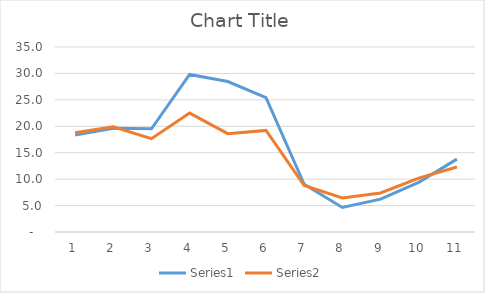
| Category | Series 0 | Series 1 |
|---|---|---|
| 0 | 18.351 | 18.778 |
| 1 | 19.634 | 19.9 |
| 2 | 19.515 | 17.659 |
| 3 | 29.81 | 22.499 |
| 4 | 28.462 | 18.605 |
| 5 | 25.44 | 19.224 |
| 6 | 9.032 | 8.794 |
| 7 | 4.631 | 6.429 |
| 8 | 6.224 | 7.393 |
| 9 | 9.385 | 10.182 |
| 10 | 13.783 | 12.307 |